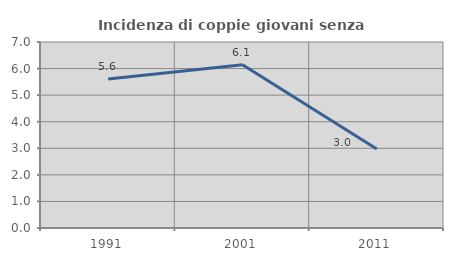
| Category | Incidenza di coppie giovani senza figli |
|---|---|
| 1991.0 | 5.605 |
| 2001.0 | 6.147 |
| 2011.0 | 2.97 |